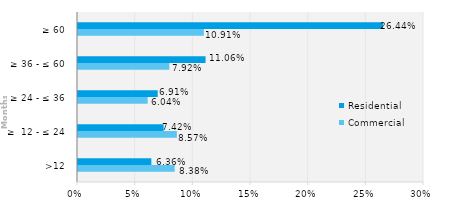
| Category | Commercial | Residential |
|---|---|---|
| >12 | 0.084 | 0.064 |
| ≥  12 - ≤ 24 | 0.086 | 0.074 |
| ≥ 24 - ≤ 36 | 0.06 | 0.069 |
| ≥ 36 - ≤ 60 | 0.079 | 0.111 |
| ≥ 60 | 0.109 | 0.264 |